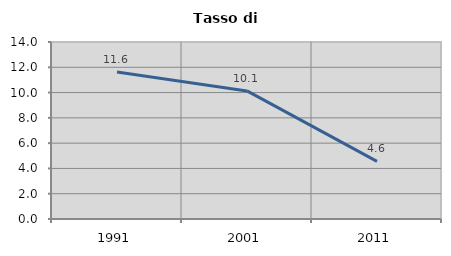
| Category | Tasso di disoccupazione   |
|---|---|
| 1991.0 | 11.62 |
| 2001.0 | 10.131 |
| 2011.0 | 4.56 |